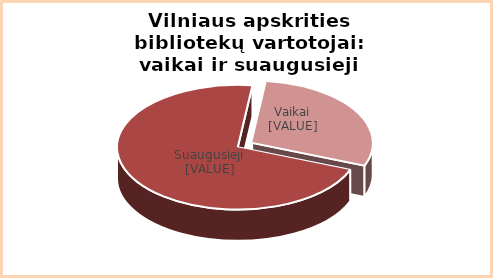
| Category | Series 0 |
|---|---|
| Vaikai | 0.29 |
| Suaugusieji | 0.71 |